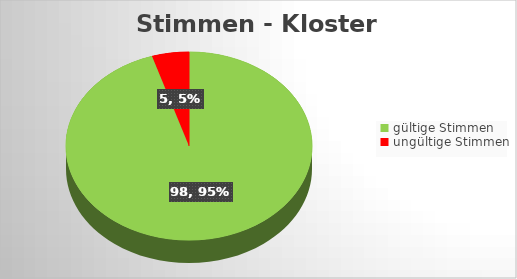
| Category | Series 0 |
|---|---|
| gültige Stimmen | 98 |
| ungültige Stimmen | 5 |